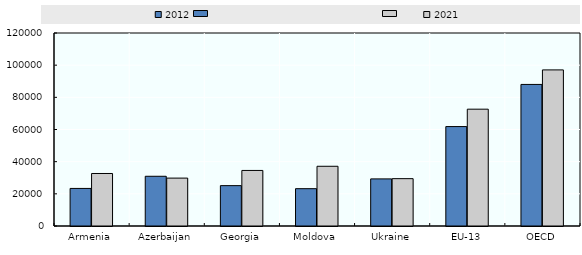
| Category | 2012 | 2021 |
|---|---|---|
| Armenia | 23361.03 | 32648.25 |
| Azerbaijan | 30918.55 | 29781.89 |
| Georgia | 25093.93 | 34537.34 |
| Moldova | 23201.54 | 37138.17 |
| Ukraine | 29300.4 | 29442.41 |
| EU-13 | 61823.789 | 72632.542 |
| OECD | 88027.497 | 97059.576 |